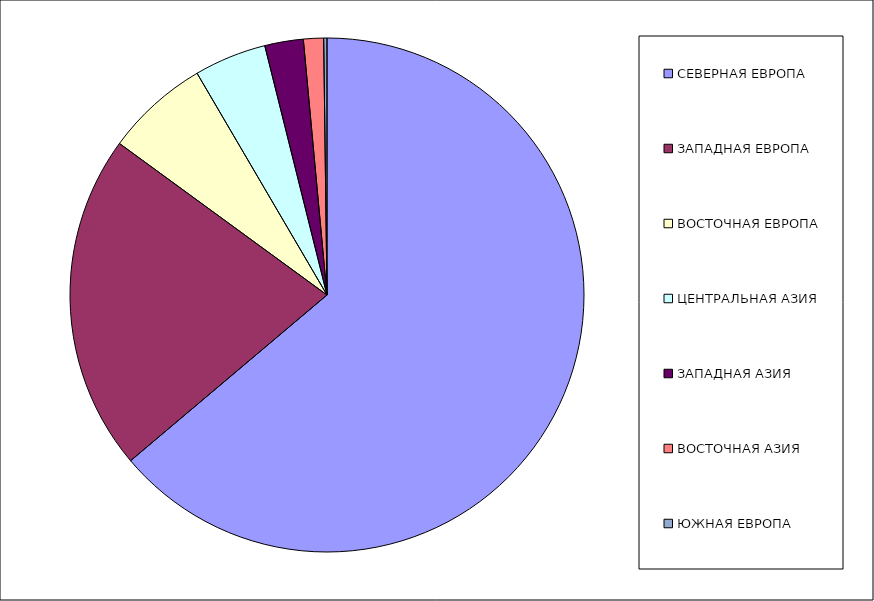
| Category | Оборот |
|---|---|
| СЕВЕРНАЯ ЕВРОПА | 63.844 |
| ЗАПАДНАЯ ЕВРОПА | 21.192 |
| ВОСТОЧНАЯ ЕВРОПА | 6.526 |
| ЦЕНТРАЛЬНАЯ АЗИЯ | 4.543 |
| ЗАПАДНАЯ АЗИЯ | 2.423 |
| ВОСТОЧНАЯ АЗИЯ | 1.264 |
| ЮЖНАЯ ЕВРОПА | 0.207 |